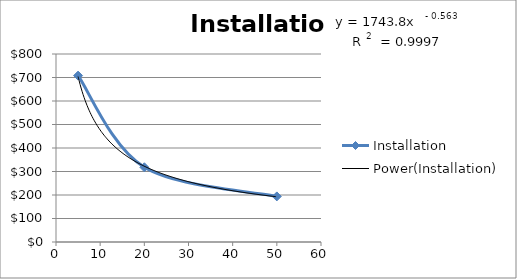
| Category | Installation |
|---|---|
| 5.0 | 708 |
| 20.0 | 318 |
| 50.0 | 194 |